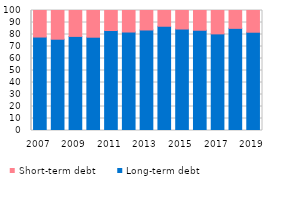
| Category | Long-term debt | Short-term debt |
|---|---|---|
| 2007 | 77.884 | 22.116 |
| 2008 | 76.082 | 23.918 |
| 2009 | 78.418 | 21.582 |
| 2010 | 77.751 | 22.249 |
| 2011 | 83.33 | 16.67 |
| 2012 | 82.063 | 17.937 |
| 2013 | 83.759 | 16.241 |
| 2014 | 86.878 | 13.122 |
| 2015 | 84.569 | 15.431 |
| 2016 | 83.543 | 16.457 |
| 2017 | 80.513 | 19.487 |
| 2018 | 85.123 | 14.877 |
| 2019 | 81.897 | 18.103 |